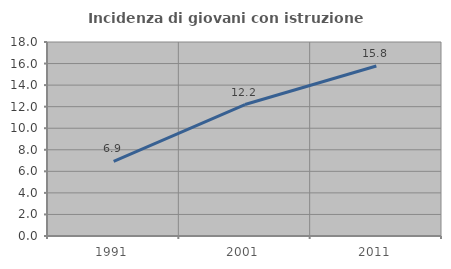
| Category | Incidenza di giovani con istruzione universitaria |
|---|---|
| 1991.0 | 6.923 |
| 2001.0 | 12.195 |
| 2011.0 | 15.768 |